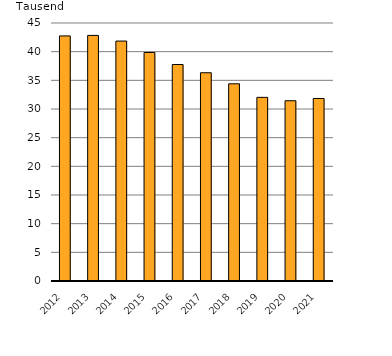
| Category | durchschnittlicher Monatsbestand |
|---|---|
| 2012.0 | 42.748 |
| 2013.0 | 42.836 |
| 2014.0 | 41.849 |
| 2015.0 | 39.859 |
| 2016.0 | 37.757 |
| 2017.0 | 36.324 |
| 2018.0 | 34.395 |
| 2019.0 | 32.029 |
| 2020.0 | 31.441 |
| 2021.0 | 31.833 |